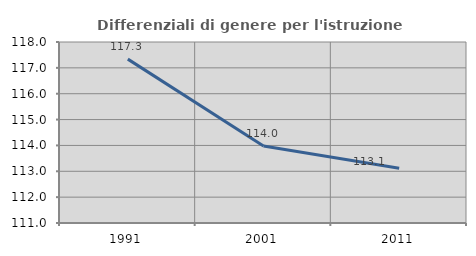
| Category | Differenziali di genere per l'istruzione superiore |
|---|---|
| 1991.0 | 117.338 |
| 2001.0 | 113.974 |
| 2011.0 | 113.117 |